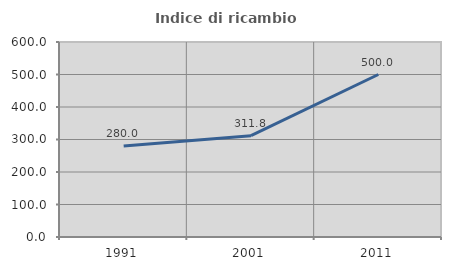
| Category | Indice di ricambio occupazionale  |
|---|---|
| 1991.0 | 280 |
| 2001.0 | 311.765 |
| 2011.0 | 500 |